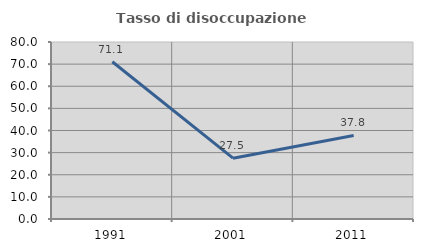
| Category | Tasso di disoccupazione giovanile  |
|---|---|
| 1991.0 | 71.053 |
| 2001.0 | 27.5 |
| 2011.0 | 37.778 |